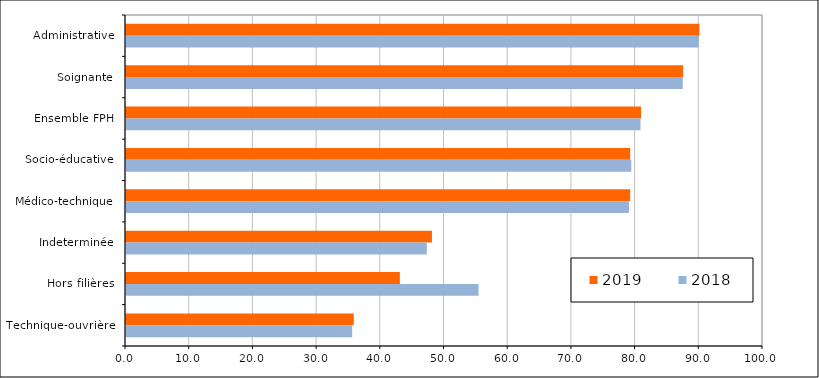
| Category | 2019 | 2018 |
|---|---|---|
| Administrative | 90.02 | 89.93 |
| Soignante | 87.46 | 87.41 |
| Ensemble FPH | 80.86 | 80.77 |
| Socio-éducative | 79.15 | 79.33 |
| Médico-technique | 79.15 | 78.96 |
| Indeterminée | 48.03 | 47.23 |
| Hors filières | 42.99 | 55.35 |
| Technique-ouvrière | 35.76 | 35.51 |